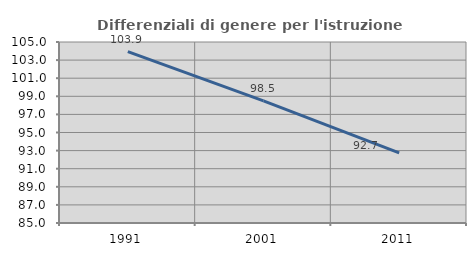
| Category | Differenziali di genere per l'istruzione superiore |
|---|---|
| 1991.0 | 103.945 |
| 2001.0 | 98.504 |
| 2011.0 | 92.745 |